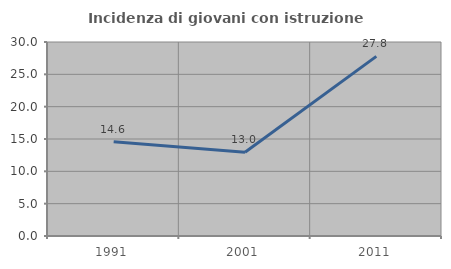
| Category | Incidenza di giovani con istruzione universitaria |
|---|---|
| 1991.0 | 14.583 |
| 2001.0 | 12.963 |
| 2011.0 | 27.778 |